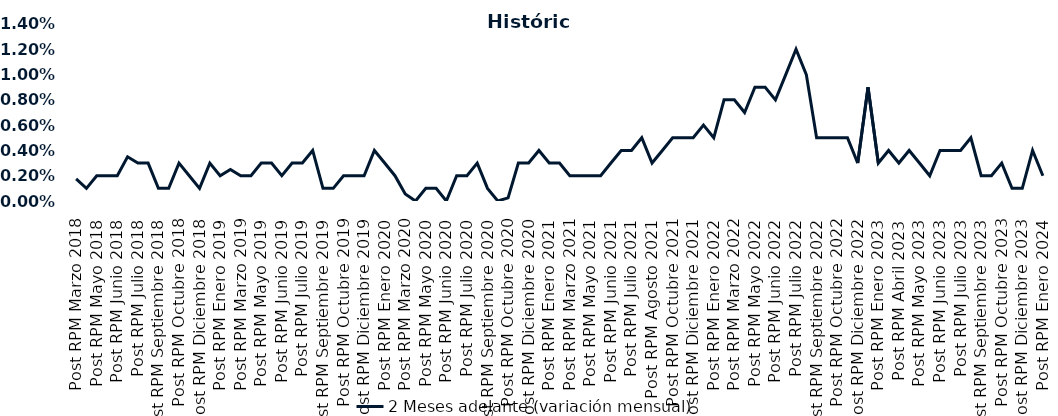
| Category | 2 Meses adelante (variación mensual) |
|---|---|
| Post RPM Marzo 2018 | 0.002 |
| Pre RPM Mayo 2018 | 0.001 |
| Post RPM Mayo 2018 | 0.002 |
| Pre RPM Junio 2018 | 0.002 |
| Post RPM Junio 2018 | 0.002 |
| Pre RPM Julio 2018 | 0.004 |
| Post RPM Julio 2018 | 0.003 |
| Pre RPM Septiembre 2018 | 0.003 |
| Post RPM Septiembre 2018 | 0.001 |
| Pre RPM Octubre 2018 | 0.001 |
| Post RPM Octubre 2018 | 0.003 |
| Pre RPM Diciembre 2018 | 0.002 |
| Post RPM Diciembre 2018 | 0.001 |
| Pre RPM Enero 2019 | 0.003 |
| Post RPM Enero 2019 | 0.002 |
| Pre RPM Marzo 2019 | 0.002 |
| Post RPM Marzo 2019 | 0.002 |
| Pre RPM Mayo 2019 | 0.002 |
| Post RPM Mayo 2019 | 0.003 |
| Pre RPM Junio 2019 | 0.003 |
| Post RPM Junio 2019 | 0.002 |
| Pre RPM Julio 2019 | 0.003 |
| Post RPM Julio 2019 | 0.003 |
| Pre RPM Septiembre 2019 | 0.004 |
| Post RPM Septiembre 2019 | 0.001 |
| Pre RPM Octubre 2019 | 0.001 |
| Post RPM Octubre 2019 | 0.002 |
| Pre RPM Diciembre 2019 | 0.002 |
| Post RPM Diciembre 2019 | 0.002 |
| Pre RPM Enero 2020 | 0.004 |
| Post RPM Enero 2020 | 0.003 |
| Pre RPM Marzo 2020 | 0.002 |
| Post RPM Marzo 2020 | 0.001 |
| Pre RPM Mayo 2020 | 0 |
| Post RPM Mayo 2020 | 0.001 |
| Pre RPM Junio 2020 | 0.001 |
| Post RPM Junio 2020 | 0 |
| Pre RPM Julio 2020 | 0.002 |
| Post RPM Julio 2020 | 0.002 |
| Pre RPM Septiembre 2020 | 0.003 |
| Post RPM Septiembre 2020 | 0.001 |
| Pre RPM Octubre 2020 | 0 |
| Post RPM Octubre 2020 | 0 |
| Pre RPM Diciembre 2020 | 0.003 |
| Post RPM Diciembre 2020 | 0.003 |
| Pre RPM Enero 2021 | 0.004 |
| Post RPM Enero 2021 | 0.003 |
| Pre RPM Marzo 2021 | 0.003 |
| Post RPM Marzo 2021 | 0.002 |
| Pre RPM Mayo 2021 | 0.002 |
| Post RPM Mayo 2021 | 0.002 |
| Pre RPM Junio 2021 | 0.002 |
| Post RPM Junio 2021 | 0.003 |
| Pre RPM Julio 2021 | 0.004 |
| Post RPM Julio 2021 | 0.004 |
| Pre RPM Agosto 2021 | 0.005 |
| Post RPM Agosto 2021 | 0.003 |
| Pre RPM Octubre 2021 | 0.004 |
| Post RPM Octubre 2021 | 0.005 |
| Pre RPM Diciembre 2021 | 0.005 |
| Post RPM Diciembre 2021 | 0.005 |
| Pre RPM Enero 2022 | 0.006 |
| Post RPM Enero 2022 | 0.005 |
| Pre RPM Marzo 2022 | 0.008 |
| Post RPM Marzo 2022 | 0.008 |
| Pre RPM Mayo 2022 | 0.007 |
| Post RPM Mayo 2022 | 0.009 |
| Pre RPM Junio 2022 | 0.009 |
| Post RPM Junio 2022 | 0.008 |
| Pre RPM Julio 2022 | 0.01 |
| Post RPM Julio 2022 | 0.012 |
| Pre RPM Septiembre 2022 | 0.01 |
| Post RPM Septiembre 2022 | 0.005 |
| Pre RPM Octubre 2022 | 0.005 |
| Post RPM Octubre 2022 | 0.005 |
| Pre RPM Diciembre 2022 | 0.005 |
| Post RPM Diciembre 2022 | 0.003 |
| Pre RPM Enero 2023 | 0.009 |
| Post RPM Enero 2023 | 0.003 |
| Pre RPM Abril 2023 | 0.004 |
| Post RPM Abril 2023 | 0.003 |
| Pre RPM Mayo 2023 | 0.004 |
| Post RPM Mayo 2023 | 0.003 |
| Pre RPM Junio 2023 | 0.002 |
| Post RPM Junio 2023 | 0.004 |
| Pre RPM Julio 2023 | 0.004 |
| Post RPM Julio 2023 | 0.004 |
| Pre RPM Septiembre 2023 | 0.005 |
| Post RPM Septiembre 2023 | 0.002 |
| Pre RPM Octubre 2023 | 0.002 |
| Post RPM Octubre 2023 | 0.003 |
| Pre RPM Diciembre 2023 | 0.001 |
| Post RPM Diciembre 2023 | 0.001 |
| Pre RPM Enero 2024 | 0.004 |
| Post RPM Enero 2024 | 0.002 |